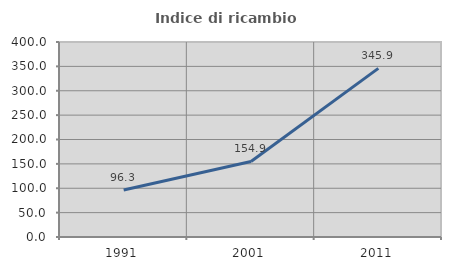
| Category | Indice di ricambio occupazionale  |
|---|---|
| 1991.0 | 96.349 |
| 2001.0 | 154.902 |
| 2011.0 | 345.915 |